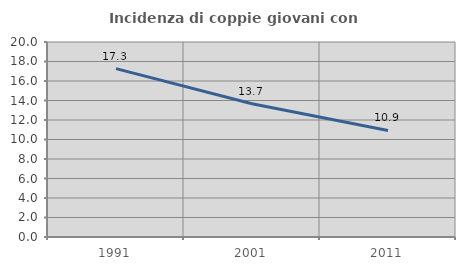
| Category | Incidenza di coppie giovani con figli |
|---|---|
| 1991.0 | 17.269 |
| 2001.0 | 13.661 |
| 2011.0 | 10.932 |